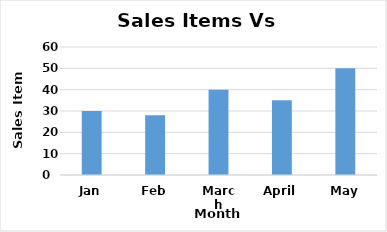
| Category | Sales Items  |
|---|---|
| Jan | 30 |
| Feb | 28 |
| March | 40 |
| April | 35 |
| May | 50 |